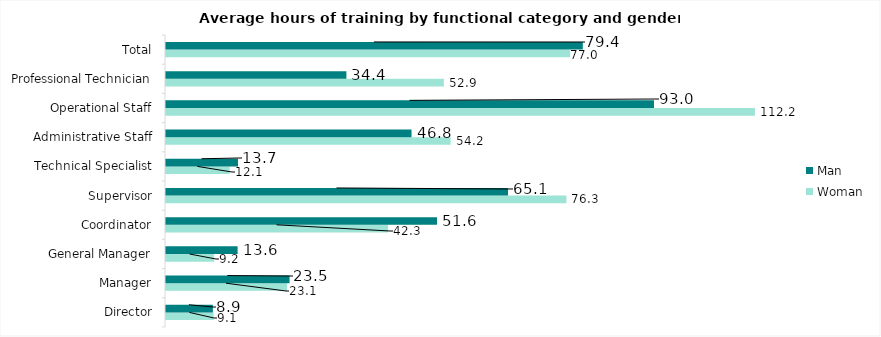
| Category | Woman | Man |
|---|---|---|
| Director | 9.079 | 8.928 |
| Manager | 23.054 | 23.54 |
| General Manager | 9.162 | 13.64 |
| Coordinator | 42.291 | 51.617 |
| Supervisor | 76.272 | 65.145 |
| Technical Specialist | 12.126 | 13.717 |
| Administrative Staff | 54.222 | 46.766 |
| Operational Staff | 112.175 | 92.952 |
| Professional Technician | 52.922 | 34.359 |
| Total | 76.984 | 79.39 |